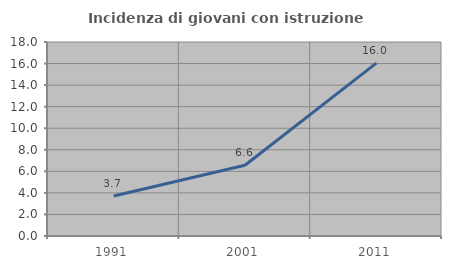
| Category | Incidenza di giovani con istruzione universitaria |
|---|---|
| 1991.0 | 3.704 |
| 2001.0 | 6.567 |
| 2011.0 | 16.038 |